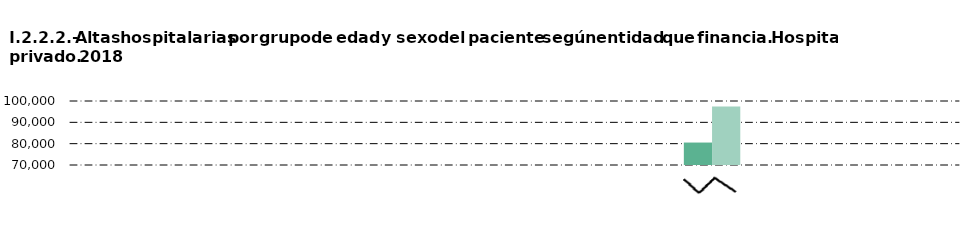
| Category |     Hombre |     Mujer |
|---|---|---|
| Andalucía | 0 | 1 |
| Castilla y León  | 4 | 10 |
| Castilla - La Mancha | 2 | 4 |
| Extremadura | 4 | 11 |
| Madrid (Comunidad de) | 2106 | 1935 |
| Resto de CC.AA. | 26 | 56 |
| Mutualidades y aseguradoras | 80524 | 97450 |
| Particulares | 3397 | 7428 |
| Otros | 889 | 665 |